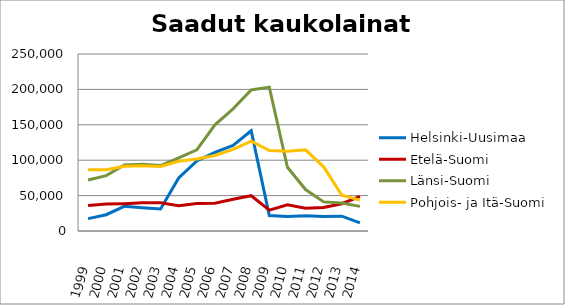
| Category | Helsinki-Uusimaa | Etelä-Suomi | Länsi-Suomi | Pohjois- ja Itä-Suomi |
|---|---|---|---|---|
| 1999.0 | 17522 | 35869 | 71976 | 86488 |
| 2000.0 | 23031 | 38041 | 78191 | 86457 |
| 2001.0 | 34827 | 38660 | 93408 | 91378 |
| 2002.0 | 32792 | 39786 | 94416 | 92315 |
| 2003.0 | 31057 | 39782 | 92348 | 91198 |
| 2004.0 | 74833 | 35686 | 103253 | 98440 |
| 2005.0 | 99027 | 38952 | 114549 | 101789 |
| 2006.0 | 111000 | 39121 | 150025 | 106608 |
| 2007.0 | 120989 | 44894 | 172512 | 115192 |
| 2008.0 | 141535 | 49850 | 199152 | 126866 |
| 2009.0 | 21879 | 29529 | 203195 | 113546 |
| 2010.0 | 20445 | 37137 | 89986 | 112598 |
| 2011.0 | 21661 | 32200 | 58527 | 114676 |
| 2012.0 | 20534 | 33074 | 41131 | 90648 |
| 2013.0 | 20959 | 38554 | 39662 | 50430 |
| 2014.0 | 11604 | 49024 | 34807 | 43624 |